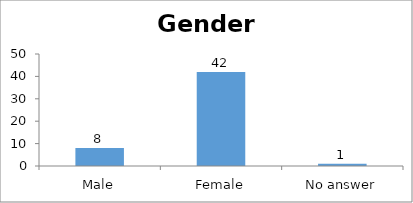
| Category | Gender |
|---|---|
| Male | 8 |
| Female | 42 |
| No answer | 1 |